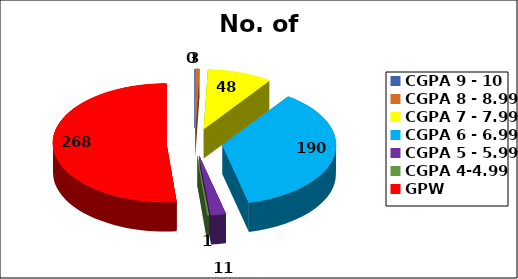
| Category | No. of Students |
|---|---|
| CGPA 9 - 10 | 0 |
| CGPA 8 - 8.99 | 3 |
| CGPA 7 - 7.99 | 48 |
| CGPA 6 - 6.99 | 190 |
| CGPA 5 - 5.99 | 11 |
| CGPA 4-4.99 | 1 |
| GPW | 268 |